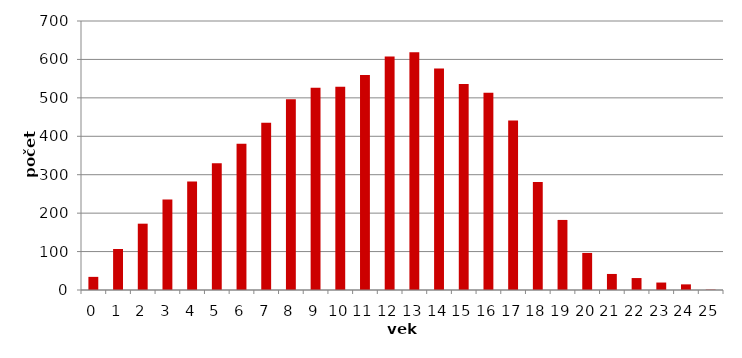
| Category | 0 |
|---|---|
| 0.0 | 34.167 |
| 1.0 | 106.75 |
| 2.0 | 172.583 |
| 3.0 | 235.333 |
| 4.0 | 282.5 |
| 5.0 | 329.583 |
| 6.0 | 380.583 |
| 7.0 | 435.25 |
| 8.0 | 496.333 |
| 9.0 | 526.083 |
| 10.0 | 528.833 |
| 11.0 | 559.25 |
| 12.0 | 607.917 |
| 13.0 | 618.833 |
| 14.0 | 576.167 |
| 15.0 | 535.917 |
| 16.0 | 513.333 |
| 17.0 | 441.25 |
| 18.0 | 281.083 |
| 19.0 | 182.333 |
| 20.0 | 96.417 |
| 21.0 | 41.75 |
| 22.0 | 31.083 |
| 23.0 | 19.417 |
| 24.0 | 14.667 |
| 25.0 | 0.917 |